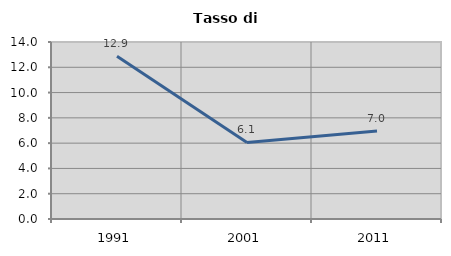
| Category | Tasso di disoccupazione   |
|---|---|
| 1991.0 | 12.879 |
| 2001.0 | 6.051 |
| 2011.0 | 6.964 |